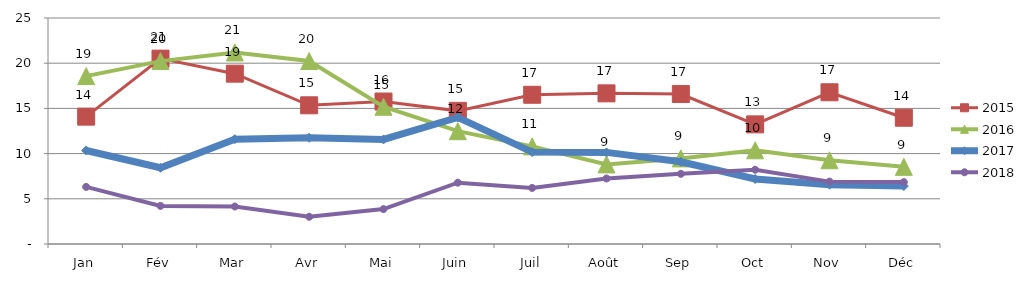
| Category | 2015 | 2016 | 2017 | 2018 |
|---|---|---|---|---|
| Jan | 14.088 | 18.573 | 10.345 | 6.315 |
| Fév | 20.504 | 20.232 | 8.433 | 4.213 |
| Mar | 18.842 | 21.188 | 11.601 | 4.15 |
| Avr | 15.342 | 20.238 | 11.751 | 3.014 |
| Mai | 15.76 | 15.18 | 11.565 | 3.859 |
| Juin | 14.728 | 12.479 | 14.003 | 6.784 |
| Juil | 16.51 | 10.799 | 10.166 | 6.203 |
| Août | 16.664 | 8.807 | 10.134 | 7.245 |
| Sep | 16.586 | 9.47 | 9.094 | 7.761 |
| Oct | 13.233 | 10.362 | 7.192 | 8.218 |
| Nov | 16.784 | 9.261 | 6.564 | 6.9 |
| Déc | 13.965 | 8.534 | 6.409 | 6.846 |